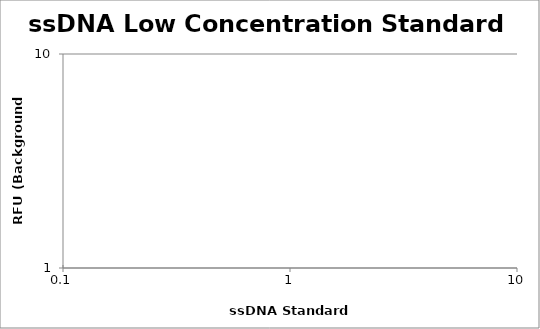
| Category | Average |
|---|---|
| 10.0 | 0 |
| 5.0 | 0 |
| 2.5 | 0 |
| 1.25 | 0 |
| 0.625 | 0 |
| 0.3125 | 0 |
| 0.15625 | 0 |